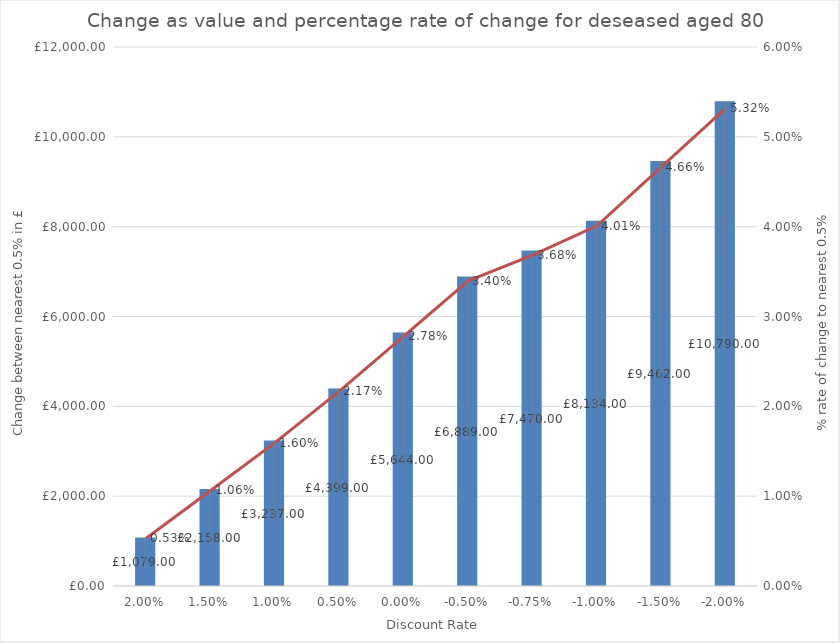
| Category | Value change |
|---|---|
| 0.02 | 1079 |
| 0.015 | 2158 |
| 0.01 | 3237 |
| 0.005 | 4399 |
| 0.0 | 5644 |
| -0.005 | 6889 |
| -0.0075 | 7470 |
| -0.01 | 8134 |
| -0.015 | 9462 |
| -0.02 | 10790 |